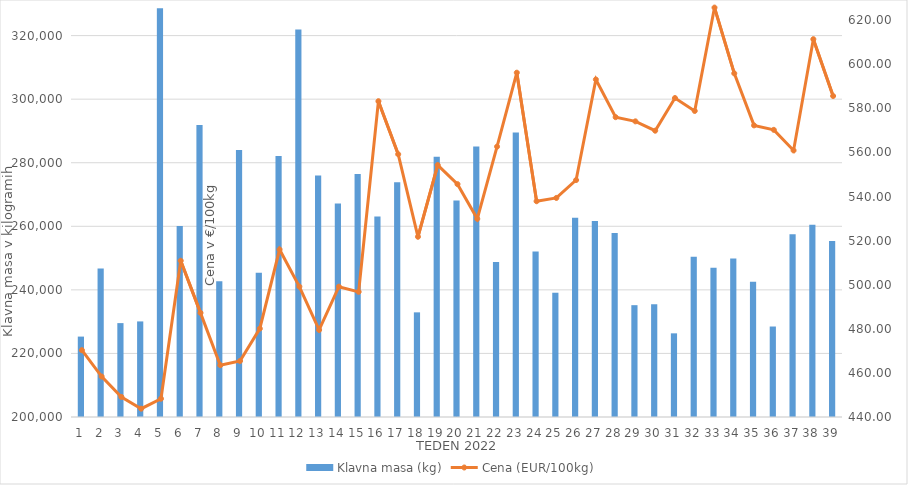
| Category | Klavna masa (kg) |
|---|---|
| 1.0 | 225300 |
| 2.0 | 246712 |
| 3.0 | 229541 |
| 4.0 | 230074 |
| 5.0 | 328640 |
| 6.0 | 260108 |
| 7.0 | 291887 |
| 8.0 | 242732 |
| 9.0 | 283987 |
| 10.0 | 245414 |
| 11.0 | 282092 |
| 12.0 | 321936 |
| 13.0 | 275950 |
| 14.0 | 267148 |
| 15.0 | 276417 |
| 16.0 | 263098 |
| 17.0 | 273824 |
| 18.0 | 232926 |
| 19.0 | 281859 |
| 20.0 | 268153 |
| 21.0 | 285073 |
| 22.0 | 248783 |
| 23.0 | 289478 |
| 24.0 | 252069 |
| 25.0 | 239099 |
| 26.0 | 262689 |
| 27.0 | 261656 |
| 28.0 | 257905 |
| 29.0 | 235185 |
| 30.0 | 235475 |
| 31.0 | 226322 |
| 32.0 | 250418 |
| 33.0 | 246996 |
| 34.0 | 249873 |
| 35.0 | 242516 |
| 36.0 | 228469 |
| 37.0 | 257511 |
| 38.0 | 260481 |
| 39.0 | 255370 |